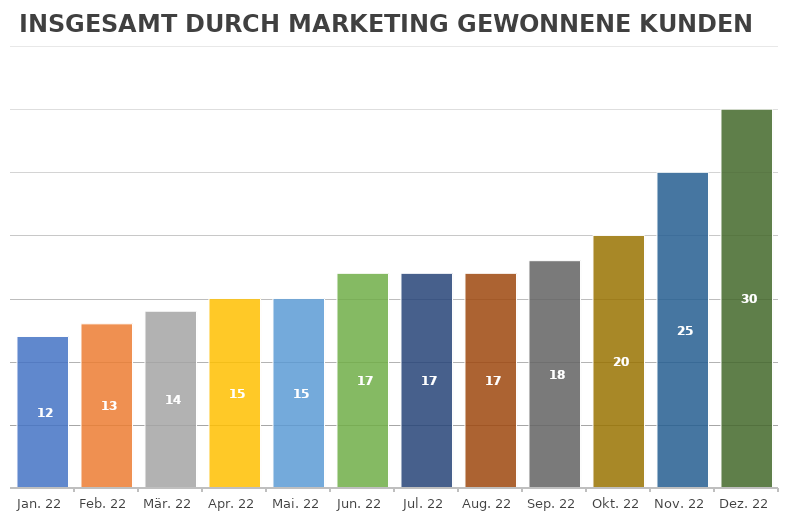
| Category | GESAMT |
|---|---|
| 2022-01-18 | 12 |
| 2022-02-18 | 13 |
| 2022-03-18 | 14 |
| 2022-04-18 | 15 |
| 2022-05-18 | 15 |
| 2022-06-18 | 17 |
| 2022-07-18 | 17 |
| 2022-08-18 | 17 |
| 2022-09-18 | 18 |
| 2022-10-18 | 20 |
| 2022-11-18 | 25 |
| 2022-12-18 | 30 |